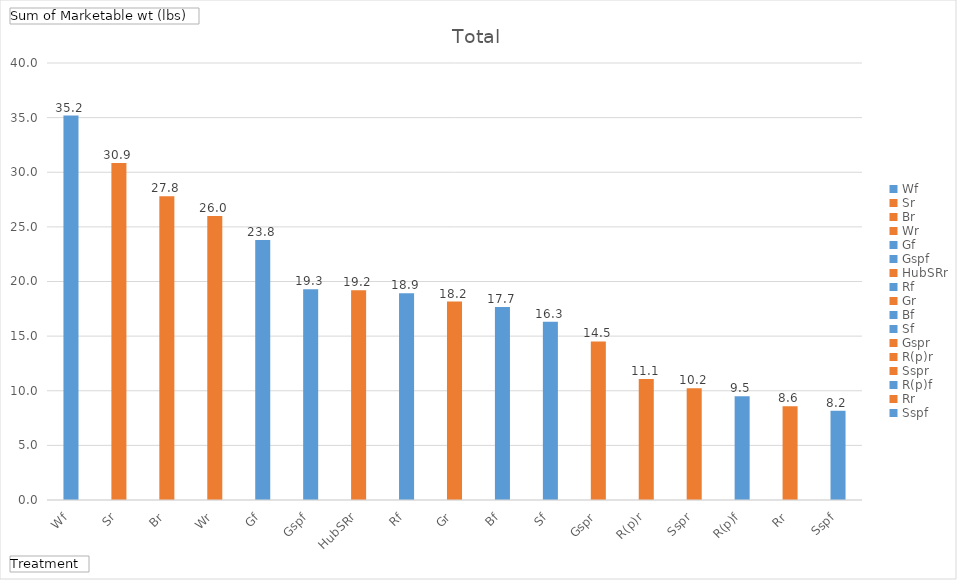
| Category | Total |
|---|---|
| Wf | 35.194 |
| Sr | 30.852 |
| Br | 27.798 |
| Wr | 25.992 |
| Gf | 23.81 |
| Gspf | 19.294 |
| HubSRr | 19.192 |
| Rf | 18.928 |
| Gr | 18.162 |
| Bf | 17.666 |
| Sf | 16.322 |
| Gspr | 14.51 |
| R(p)r | 11.066 |
| Sspr | 10.22 |
| R(p)f | 9.486 |
| Rr | 8.57 |
| Sspf | 8.18 |